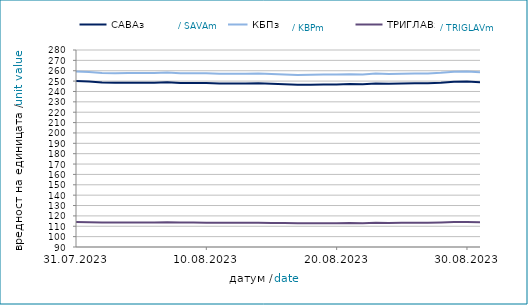
| Category | САВАз | КБПз | ТРИГЛАВз |
|---|---|---|---|
| 2023-07-31 | 250.219 | 259.267 | 114.154 |
| 2023-08-01 | 249.556 | 258.675 | 113.945 |
| 2023-08-02 | 248.725 | 257.825 | 113.632 |
| 2023-08-03 | 248.299 | 257.631 | 113.532 |
| 2023-08-04 | 248.505 | 257.782 | 113.56 |
| 2023-08-05 | 248.437 | 257.704 | 113.528 |
| 2023-08-06 | 248.451 | 257.719 | 113.536 |
| 2023-08-07 | 248.793 | 258.302 | 113.81 |
| 2023-08-08 | 248.205 | 257.64 | 113.54 |
| 2023-08-09 | 248.191 | 257.619 | 113.518 |
| 2023-08-10 | 248.172 | 257.621 | 113.501 |
| 2023-08-11 | 247.656 | 256.978 | 113.289 |
| 2023-08-12 | 247.765 | 257.099 | 113.341 |
| 2023-08-13 | 247.779 | 257.114 | 113.348 |
| 2023-08-14 | 247.948 | 257.283 | 113.414 |
| 2023-08-15 | 247.481 | 256.955 | 113.249 |
| 2023-08-16 | 247.059 | 256.434 | 113.028 |
| 2023-08-17 | 246.555 | 255.975 | 112.825 |
| 2023-08-18 | 246.575 | 256.034 | 112.868 |
| 2023-08-19 | 246.786 | 256.273 | 112.97 |
| 2023-08-20 | 246.8 | 256.288 | 112.978 |
| 2023-08-21 | 247.088 | 256.684 | 113.128 |
| 2023-08-22 | 246.887 | 256.293 | 112.942 |
| 2023-08-23 | 247.787 | 257.261 | 113.333 |
| 2023-08-24 | 247.46 | 256.908 | 113.194 |
| 2023-08-25 | 247.665 | 257.14 | 113.285 |
| 2023-08-26 | 247.865 | 257.367 | 113.383 |
| 2023-08-27 | 247.88 | 257.382 | 113.391 |
| 2023-08-28 | 248.405 | 257.983 | 113.64 |
| 2023-08-29 | 249.393 | 259.063 | 114.094 |
| 2023-08-30 | 249.555 | 259.266 | 114.204 |
| 2023-08-31 | 249 | 258.552 | 113.88 |